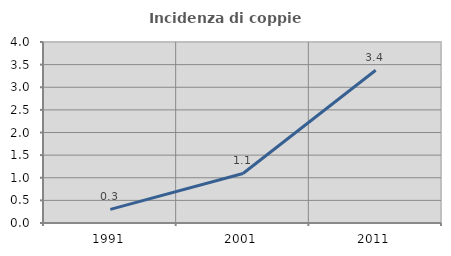
| Category | Incidenza di coppie miste |
|---|---|
| 1991.0 | 0.302 |
| 2001.0 | 1.095 |
| 2011.0 | 3.376 |